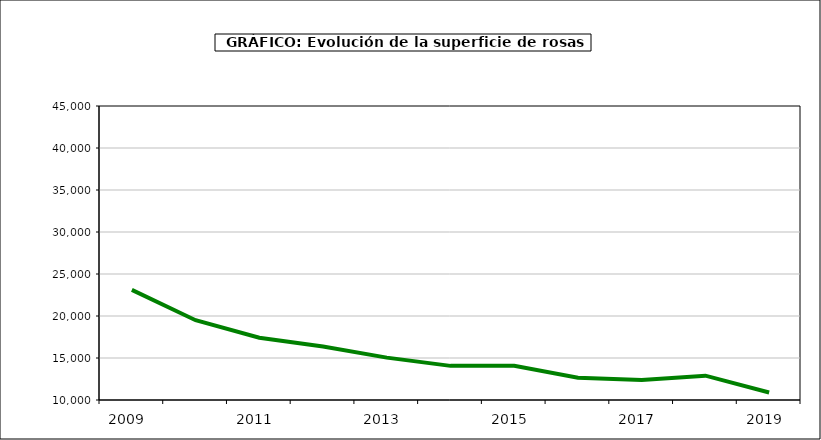
| Category | superficie |
|---|---|
| 2009.0 | 23105 |
| 2010.0 | 19496 |
| 2011.0 | 17410 |
| 2012.0 | 16373 |
| 2013.0 | 15043 |
| 2014.0 | 14063 |
| 2015.0 | 14086 |
| 2016.0 | 12651 |
| 2017.0 | 12371 |
| 2018.0 | 12895 |
| 2019.0 | 10892 |